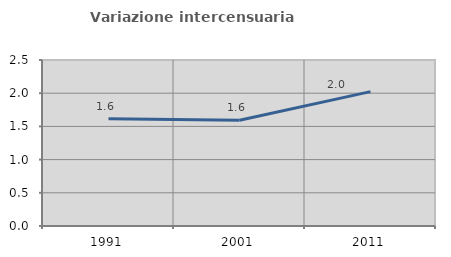
| Category | Variazione intercensuaria annua |
|---|---|
| 1991.0 | 1.615 |
| 2001.0 | 1.594 |
| 2011.0 | 2.023 |